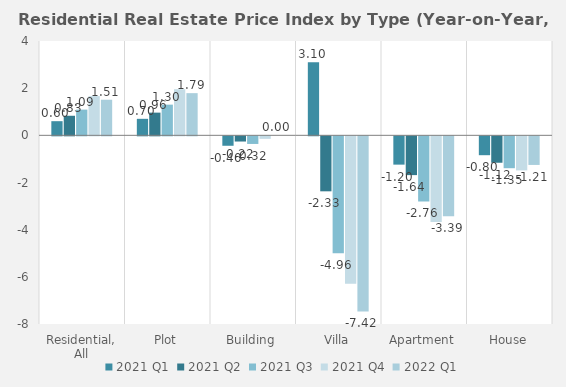
| Category | 2021 | 2022 |
|---|---|---|
| Residential, All | 1.664 | 1.509 |
| Plot | 1.955 | 1.789 |
| Building | -0.108 | 0 |
| Villa | -6.254 | -7.423 |
| Apartment | -3.627 | -3.392 |
| House | -1.445 | -1.213 |